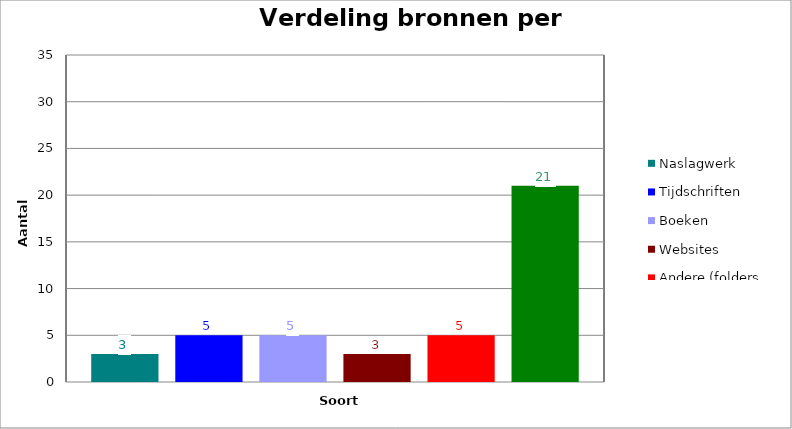
| Category | Naslagwerk | Tijdschriften | Boeken | Websites | Andere (folders, …) | Totaal |
|---|---|---|---|---|---|---|
| 0 | 3 | 5 | 5 | 3 | 5 | 21 |